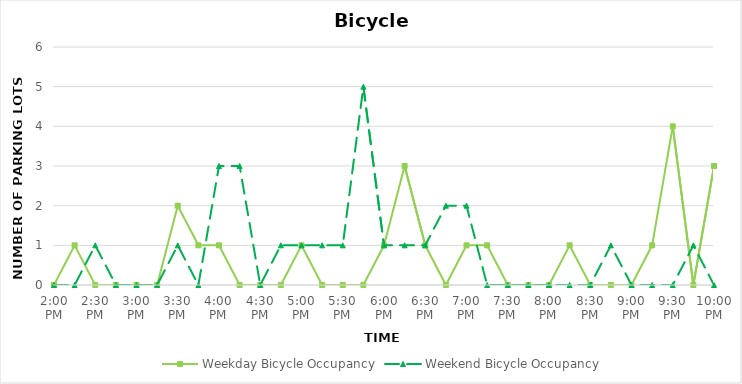
| Category | Weekday Bicycle Occupancy | Weekend Bicycle Occupancy |
|---|---|---|
| 0.5833333333333334 | 0 | 0 |
| 0.59375 | 1 | 0 |
| 0.604166666666667 | 0 | 1 |
| 0.614583333333334 | 0 | 0 |
| 0.625 | 0 | 0 |
| 0.635416666666667 | 0 | 0 |
| 0.645833333333334 | 2 | 1 |
| 0.656250000000001 | 1 | 0 |
| 0.666666666666667 | 1 | 3 |
| 0.677083333333334 | 0 | 3 |
| 0.687500000000001 | 0 | 0 |
| 0.697916666666668 | 0 | 1 |
| 0.708333333333335 | 1 | 1 |
| 0.718750000000002 | 0 | 1 |
| 0.729166666666669 | 0 | 1 |
| 0.739583333333336 | 0 | 5 |
| 0.75 | 1 | 1 |
| 0.7604166666666666 | 3 | 1 |
| 0.7708333333333334 | 1 | 1 |
| 0.78125 | 0 | 2 |
| 0.7916666666666666 | 1 | 2 |
| 0.8020833333333334 | 1 | 0 |
| 0.8125 | 0 | 0 |
| 0.8229166666666666 | 0 | 0 |
| 0.8333333333333334 | 0 | 0 |
| 0.84375 | 1 | 0 |
| 0.8541666666666666 | 0 | 0 |
| 0.8645833333333334 | 0 | 1 |
| 0.875 | 0 | 0 |
| 0.8854166666666666 | 1 | 0 |
| 0.8958333333333334 | 4 | 0 |
| 0.90625 | 0 | 1 |
| 0.9166666666666666 | 3 | 0 |